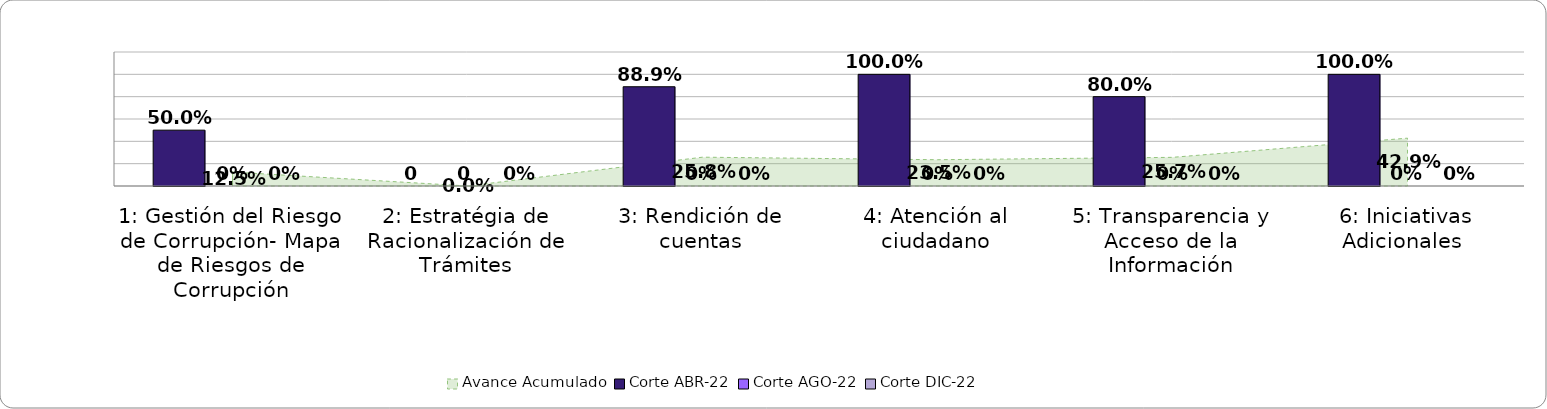
| Category | Corte ABR-22 | Corte AGO-22 | Corte DIC-22 |
|---|---|---|---|
| 1: Gestión del Riesgo de Corrupción- Mapa de Riesgos de Corrupción | 0.5 | 0 | 0 |
| 2: Estratégia de Racionalización de Trámites | 0 | 0 | 0 |
| 3: Rendición de cuentas | 0.889 | 0 | 0 |
| 4: Atención al ciudadano | 1 | 0 | 0 |
| 5: Transparencia y Acceso de la Información | 0.8 | 0 | 0 |
| 6: Iniciativas Adicionales  | 1 | 0 | 0 |